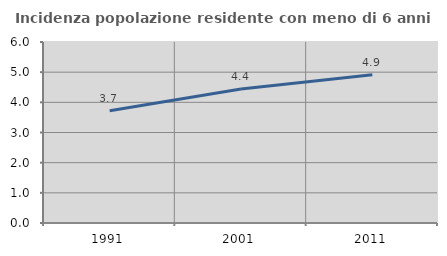
| Category | Incidenza popolazione residente con meno di 6 anni |
|---|---|
| 1991.0 | 3.723 |
| 2001.0 | 4.442 |
| 2011.0 | 4.915 |